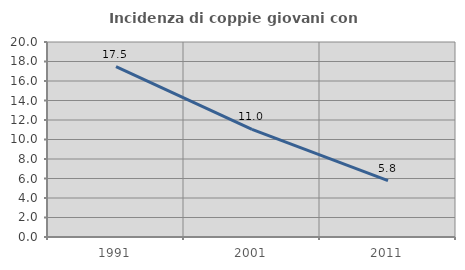
| Category | Incidenza di coppie giovani con figli |
|---|---|
| 1991.0 | 17.479 |
| 2001.0 | 11.03 |
| 2011.0 | 5.777 |